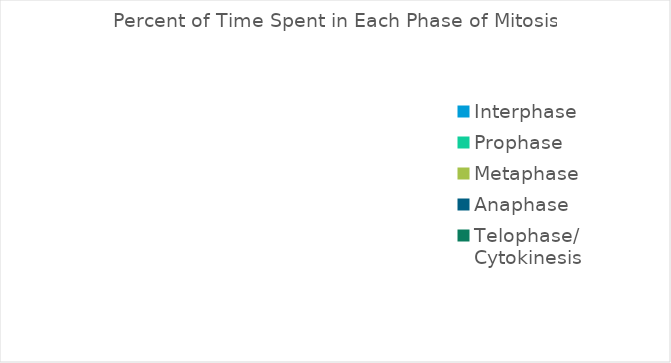
| Category | Percent of cells |
|---|---|
| Interphase | 0 |
| Prophase | 0 |
| Metaphase | 0 |
| Anaphase | 0 |
| Telophase/ Cytokinesis | 0 |